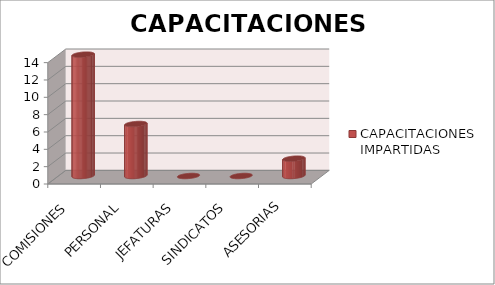
| Category | CAPACITACIONES IMPARTIDAS  |
|---|---|
| COMISIONES  | 14 |
| PERSONAL  | 6 |
| JEFATURAS  | 0 |
| SINDICATOS  | 0 |
| ASESORIAS  | 2 |